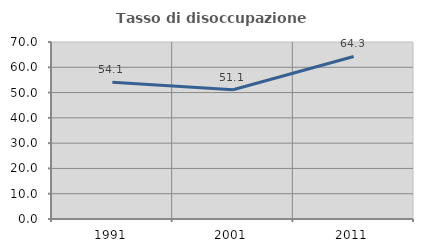
| Category | Tasso di disoccupazione giovanile  |
|---|---|
| 1991.0 | 54.082 |
| 2001.0 | 51.111 |
| 2011.0 | 64.286 |